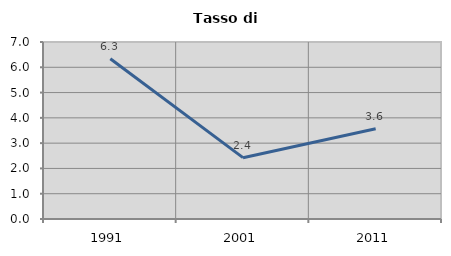
| Category | Tasso di disoccupazione   |
|---|---|
| 1991.0 | 6.335 |
| 2001.0 | 2.426 |
| 2011.0 | 3.571 |